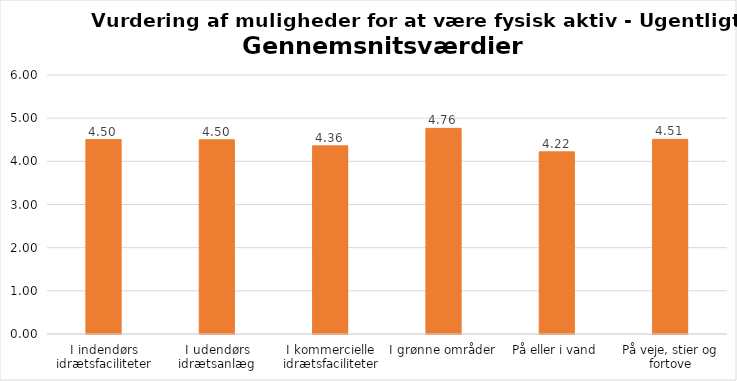
| Category | Gennemsnit |
|---|---|
| I indendørs idrætsfaciliteter | 4.505 |
| I udendørs idrætsanlæg | 4.498 |
| I kommercielle idrætsfaciliteter | 4.358 |
| I grønne områder | 4.764 |
| På eller i vand | 4.22 |
| På veje, stier og fortove | 4.51 |